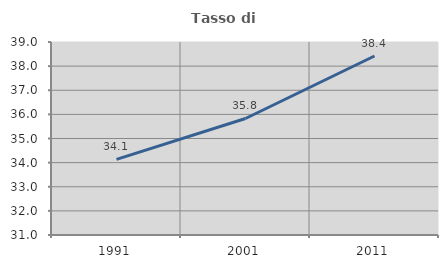
| Category | Tasso di occupazione   |
|---|---|
| 1991.0 | 34.137 |
| 2001.0 | 35.83 |
| 2011.0 | 38.419 |